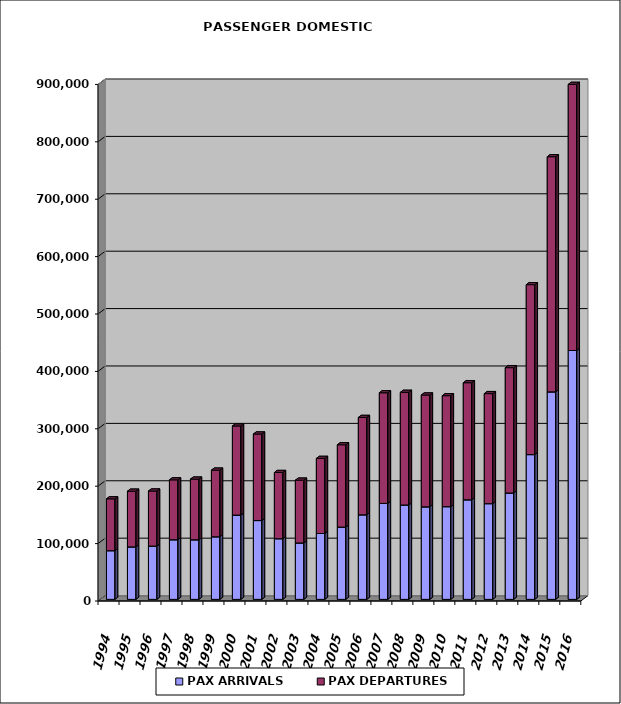
| Category | PAX ARRIVALS | PAX DEPARTURES |
|---|---|---|
| 1994.0 | 84825 | 90327 |
| 1995.0 | 91425 | 97036 |
| 1996.0 | 92893 | 95885 |
| 1997.0 | 103896 | 104299 |
| 1998.0 | 103817 | 105688 |
| 1999.0 | 109042 | 116118 |
| 2000.0 | 146885 | 155187 |
| 2001.0 | 137314 | 150770 |
| 2002.0 | 105704 | 115336 |
| 2003.0 | 98301 | 109394 |
| 2004.0 | 114742 | 130835 |
| 2005.0 | 126006 | 143365 |
| 2006.0 | 147322 | 169651 |
| 2007.0 | 167242 | 192708 |
| 2008.0 | 164483 | 196187 |
| 2009.0 | 161220 | 194820 |
| 2010.0 | 161553 | 193319 |
| 2011.0 | 173496 | 203977 |
| 2012.0 | 166786 | 191682 |
| 2013.0 | 185378 | 218309 |
| 2014.0 | 252223 | 296051 |
| 2015.0 | 361525 | 409668 |
| 2016.0 | 433598 | 463633 |